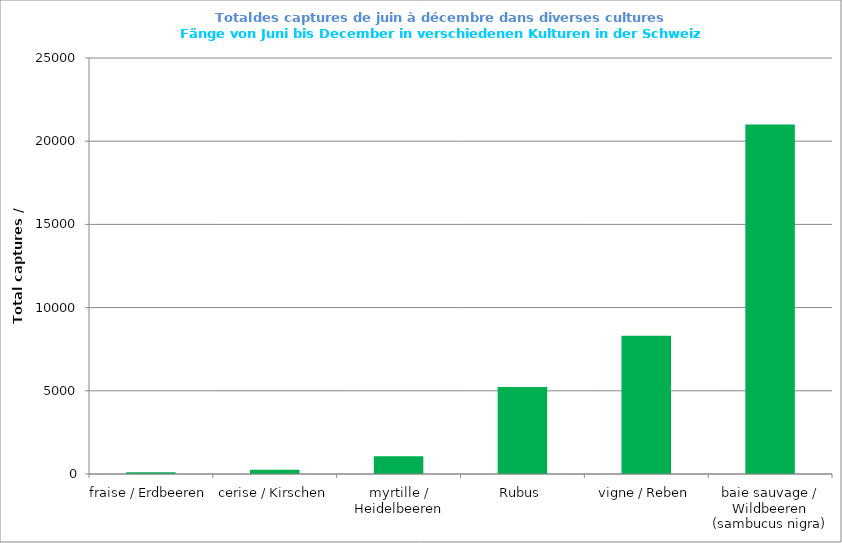
| Category | Series 0 |
|---|---|
| fraise / Erdbeeren | 106 |
| cerise / Kirschen | 251 |
| myrtille / Heidelbeeren | 1072 |
| Rubus | 5221 |
| vigne / Reben | 8308 |
| baie sauvage / Wildbeeren (sambucus nigra) | 21000 |